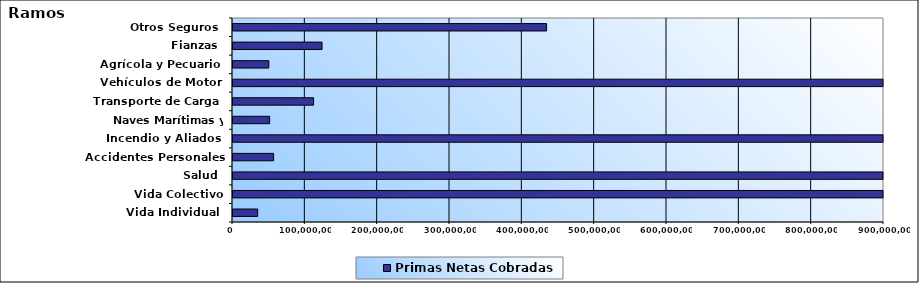
| Category | Primas Netas Cobradas |
|---|---|
| Vida Individual  | 34109230.69 |
| Vida Colectivo | 1241596601.05 |
| Salud  | 1929333959.66 |
| Accidentes Personales | 56156052.51 |
| Incendio y Aliados  | 1639138854.98 |
| Naves Marítimas y Aéreas  | 50705470.92 |
| Transporte de Carga  | 111404087.54 |
| Vehículos de Motor  | 1766863030.13 |
| Agrícola y Pecuario  | 49549222.75 |
| Fianzas  | 123100159.54 |
| Otros Seguros  | 433552431.34 |